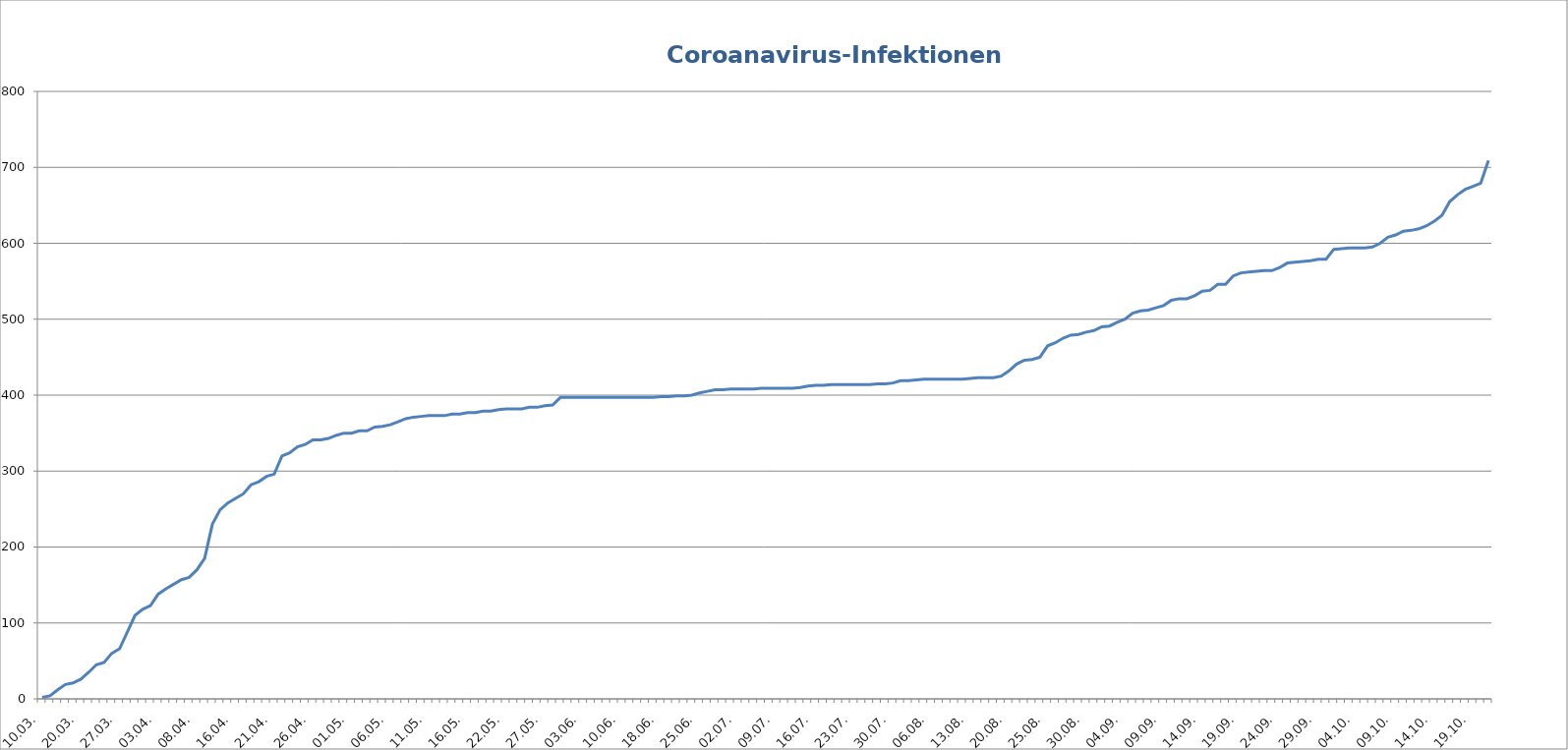
| Category | Infektionen
gesamt |
|---|---|
| 10.03. | 2 |
| 13.03. | 4 |
| 16.03. | 12 |
| 18.03. | 19 |
| 19.03. | 21 |
| 20.03. | 26 |
| 23.03. | 35 |
| 24.03. | 45 |
| 25.03. | 48 |
| 26.03. | 60 |
| 27.03. | 66 |
| 30.03. | 88 |
| 31.03. | 110 |
| 01.04. | 118 |
| 02.04. | 123 |
| 03.04. | 138 |
| 04.04. | 145 |
| 05.04. | 151 |
| 06.04. | 157 |
| 07.04. | 160 |
| 08.04. | 170 |
| 09.04. | 185 |
| 13.04. | 230 |
| 14.04. | 249 |
| 15.04. | 258 |
| 16.04. | 264 |
| 17.04. | 270 |
| 18.04. | 282 |
| 19.04. | 286 |
| 20.04. | 293 |
| 21.04. | 296 |
| 22.04. | 320 |
| 23.04. | 324 |
| 24.04. | 332 |
| 25.04. | 335 |
| 26.04. | 341 |
| 27.04. | 341 |
| 28.04. | 343 |
| 29.04. | 347 |
| 30.04. | 350 |
| 01.05. | 350 |
| 02.05. | 353 |
| 03.05. | 353 |
| 04.05. | 358 |
| 05.05. | 359 |
| 06.05. | 361 |
| 07.05. | 365 |
| 08.05. | 369 |
| 09.05. | 371 |
| 10.05. | 372 |
| 11.05. | 373 |
| 12.05. | 373 |
| 13.05. | 373 |
| 14.05. | 375 |
| 15.05. | 375 |
| 16.05. | 377 |
| 17.05. | 377 |
| 18.05. | 379 |
| 19.05. | 379 |
| 20.05. | 381 |
| 22.05. | 382 |
| 23.05. | 382 |
| 24.05. | 382 |
| 25.05. | 384 |
| 26.05. | 384 |
| 27.05. | 386 |
| 28.05. | 387 |
| 29.05. | 397 |
| 30.05. | 397 |
| 02.06. | 397 |
| 03.06. | 397 |
| 04.06. | 397 |
| 05.06. | 397 |
| 08.06. | 397 |
| 09.06. | 397 |
| 10.06. | 397 |
| 12.06. | 397 |
| 15.06. | 397 |
| 16.06. | 397 |
| 17.06. | 397 |
| 18.06. | 398 |
| 19.06. | 398 |
| 22.06. | 399 |
| 23.06. | 399 |
| 24.06. | 400 |
| 25.06. | 403 |
| 26.06. | 405 |
| 29.06. | 407 |
| 30.06. | 407 |
| 01.07. | 408 |
| 02.07. | 408 |
| 03.07. | 408 |
| 06.07. | 408 |
| 07.07. | 409 |
| 08.07. | 409 |
| 09.07. | 409 |
| 10.07. | 409 |
| 13.07. | 409 |
| 14.07. | 410 |
| 15.07. | 412 |
| 16.07. | 413 |
| 17.07. | 413 |
| 20.07. | 414 |
| 21.07. | 414 |
| 22.07. | 414 |
| 23.07. | 414 |
| 24.07. | 414 |
| 27.07. | 414 |
| 28.07. | 415 |
| 29.07. | 415 |
| 30.07. | 416 |
| 31.07. | 419 |
| 03.08. | 419 |
| 04.08. | 420 |
| 05.08. | 421 |
| 06.08. | 421 |
| 07.08. | 421 |
| 10.08. | 421 |
| 11.08. | 421 |
| 12.08. | 421 |
| 13.08. | 422 |
| 14.08. | 423 |
| 17.08. | 423 |
| 18.08. | 423 |
| 19.08. | 425 |
| 20.08. | 432 |
| 21.08. | 441 |
| 22.08. | 446 |
| 23.08. | 447 |
| 24.08. | 450 |
| 25.08. | 465 |
| 26.08. | 469 |
| 27.08. | 475 |
| 28.08. | 479 |
| 29.08. | 480 |
| 30.08. | 483 |
| 31.08. | 485 |
| 01.09. | 490 |
| 02.09. | 491 |
| 03.09. | 496 |
| 04.09. | 500 |
| 05.09. | 508 |
| 06.09. | 511 |
| 07.09. | 512 |
| 08.09. | 515 |
| 09.09. | 518 |
| 10.09. | 525 |
| 11.09. | 527 |
| 12.09. | 527 |
| 13.09. | 531 |
| 14.09. | 537 |
| 15.09. | 538 |
| 16.09. | 546 |
| 17.09. | 546 |
| 18.09. | 557 |
| 19.09. | 561 |
| 20.09. | 562 |
| 21.09. | 563 |
| 22.09. | 564 |
| 23.o9. | 564 |
| 24.09. | 568 |
| 25.09. | 574 |
| 26.09. | 575 |
| 27.09. | 576 |
| 28.09. | 577 |
| 29.09. | 579 |
| 30.09. | 579 |
| 01.10. | 592 |
| 02.10. | 593 |
| 03.10. | 594 |
| 04.10. | 594 |
| 05.10. | 594 |
| 06.10. | 595 |
| 07.10. | 600 |
| 08.10. | 608 |
| 09.10. | 611 |
| 10.10. | 616 |
| 11.10. | 617 |
| 12.10. | 619 |
| 13.10. | 623 |
| 14.10. | 629 |
| 15.10. | 637 |
| 16.10. | 655 |
| 17.10. | 664 |
| 18.10. | 671 |
| 19.10. | 675 |
| 20.10. | 679 |
| 21.10. | 709 |